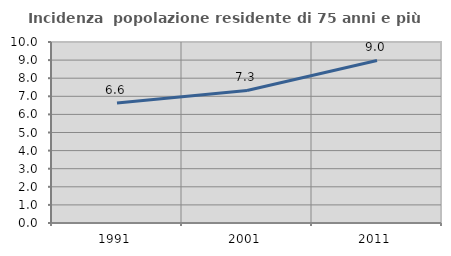
| Category | Incidenza  popolazione residente di 75 anni e più |
|---|---|
| 1991.0 | 6.623 |
| 2001.0 | 7.321 |
| 2011.0 | 8.978 |